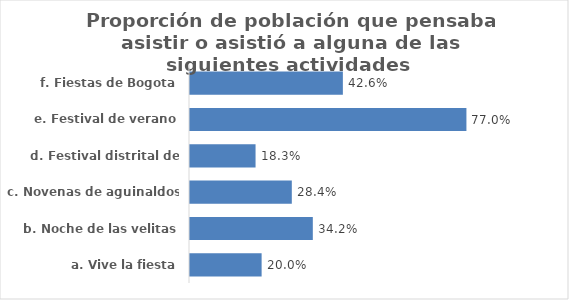
| Category | % Sí |
|---|---|
|  a. Vive la fiesta | 0.2 |
|  b. Noche de las velitas | 0.342 |
|  c. Novenas de aguinaldos | 0.284 |
|  d. Festival distrital de porras | 0.183 |
|  e. Festival de verano | 0.77 |
|  f. Fiestas de Bogota | 0.426 |